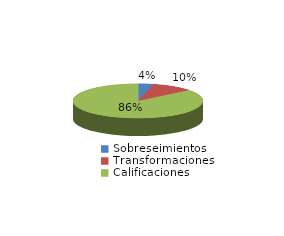
| Category | Series 0 |
|---|---|
| Sobreseimientos | 10 |
| Transformaciones | 27 |
| Calificaciones | 227 |